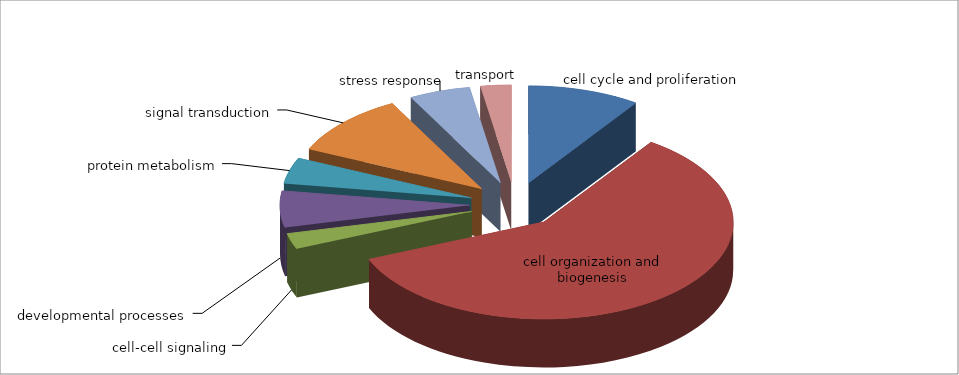
| Category | Series 0 |
|---|---|
| cell cycle and proliferation | 11 |
| cell organization and biogenesis | 68 |
| cell-cell signaling | 3 |
| developmental processes | 7 |
| protein metabolism | 5 |
| signal transduction | 12 |
| stress response | 6 |
| transport | 3 |